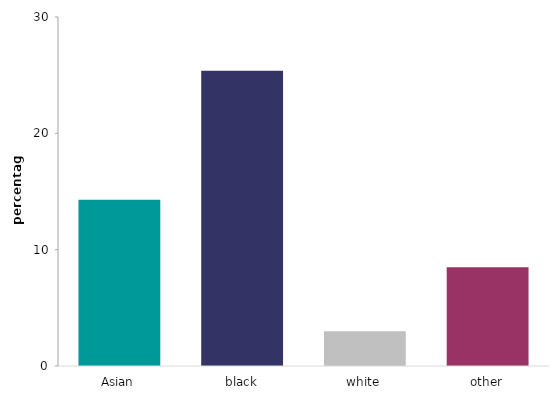
| Category | treated worse than other races |
|---|---|
| Asian | 14.295 |
| black | 25.374 |
| white | 2.986 |
| other | 8.485 |